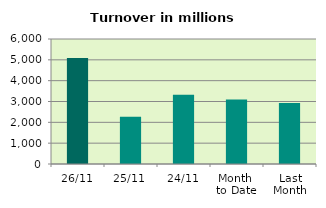
| Category | Series 0 |
|---|---|
| 26/11 | 5084.083 |
| 25/11 | 2272.47 |
| 24/11 | 3327.838 |
| Month 
to Date | 3093.153 |
| Last
Month | 2924.951 |